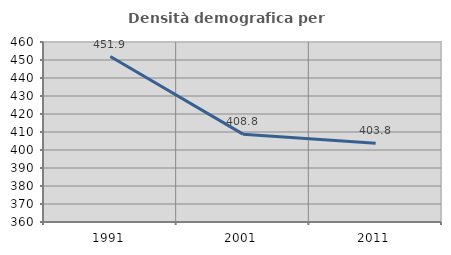
| Category | Densità demografica |
|---|---|
| 1991.0 | 451.938 |
| 2001.0 | 408.811 |
| 2011.0 | 403.8 |